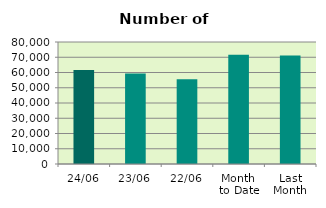
| Category | Series 0 |
|---|---|
| 24/06 | 61622 |
| 23/06 | 59402 |
| 22/06 | 55652 |
| Month 
to Date | 71660 |
| Last
Month | 71072.3 |